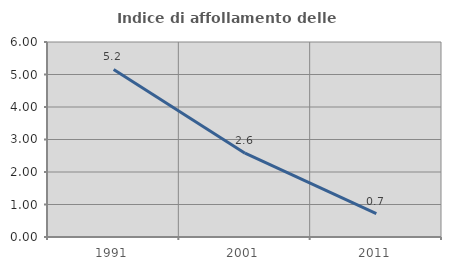
| Category | Indice di affollamento delle abitazioni  |
|---|---|
| 1991.0 | 5.157 |
| 2001.0 | 2.579 |
| 2011.0 | 0.716 |